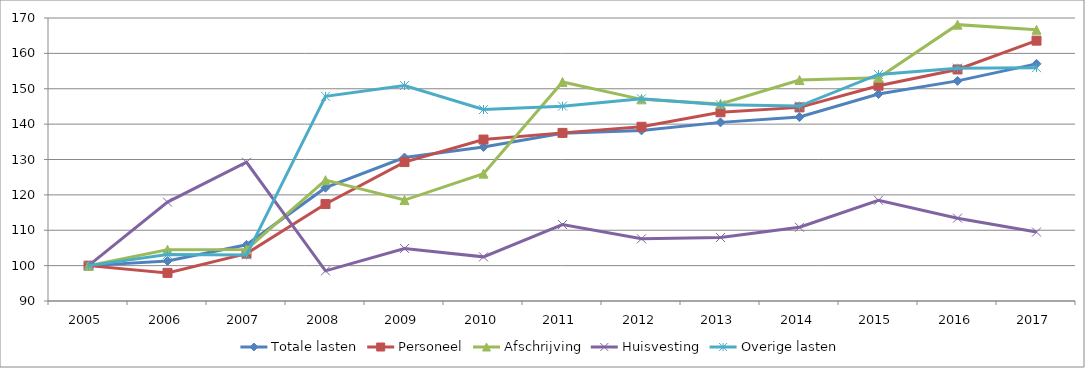
| Category | Totale lasten | Personeel | Afschrijving | Huisvesting | Overige lasten |
|---|---|---|---|---|---|
| 2005.0 | 100 | 100 | 100 | 100 | 100 |
| 2006.0 | 101.301 | 97.949 | 104.506 | 117.948 | 103.111 |
| 2007.0 | 105.876 | 103.387 | 104.584 | 129.213 | 102.991 |
| 2008.0 | 122.03 | 117.407 | 124.16 | 98.531 | 147.864 |
| 2009.0 | 130.557 | 129.274 | 118.537 | 104.856 | 150.913 |
| 2010.0 | 133.535 | 135.64 | 125.999 | 102.477 | 144.12 |
| 2011.0 | 137.387 | 137.525 | 151.917 | 111.609 | 145.079 |
| 2012.0 | 138.226 | 139.248 | 147.003 | 107.587 | 147.164 |
| 2013.0 | 140.495 | 143.356 | 145.723 | 107.943 | 145.466 |
| 2014.0 | 142 | 144.734 | 152.46 | 110.841 | 145.114 |
| 2015.0 | 148.497 | 150.859 | 153.115 | 118.473 | 154.039 |
| 2016.0 | 152.229 | 155.452 | 168.123 | 113.419 | 155.827 |
| 2017.0 | 157.039 | 163.599 | 166.664 | 109.487 | 155.956 |